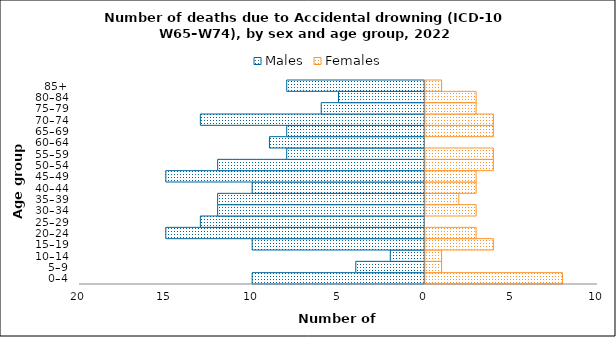
| Category | Males | Females |
|---|---|---|
| 0–4 | -10 | 8 |
| 5–9 | -4 | 1 |
| 10–14 | -2 | 1 |
| 15–19 | -10 | 4 |
| 20–24 | -15 | 3 |
| 25–29 | -13 | 0 |
| 30–34 | -12 | 3 |
| 35–39 | -12 | 2 |
| 40–44 | -10 | 3 |
| 45–49 | -15 | 3 |
| 50–54 | -12 | 4 |
| 55–59 | -8 | 4 |
| 60–64 | -9 | 0 |
| 65–69 | -8 | 4 |
| 70–74 | -13 | 4 |
| 75–79 | -6 | 3 |
| 80–84 | -5 | 3 |
| 85+ | -8 | 1 |